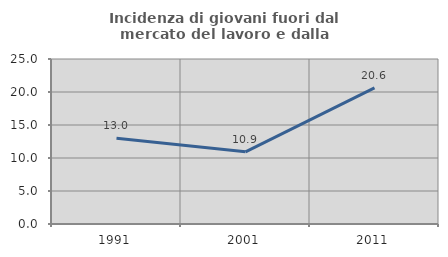
| Category | Incidenza di giovani fuori dal mercato del lavoro e dalla formazione  |
|---|---|
| 1991.0 | 13 |
| 2001.0 | 10.938 |
| 2011.0 | 20.635 |